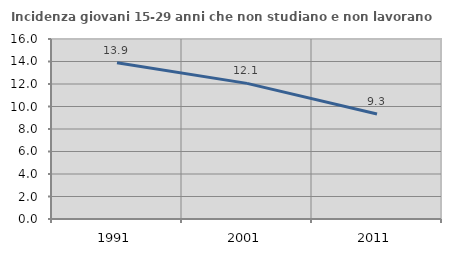
| Category | Incidenza giovani 15-29 anni che non studiano e non lavorano  |
|---|---|
| 1991.0 | 13.895 |
| 2001.0 | 12.057 |
| 2011.0 | 9.333 |